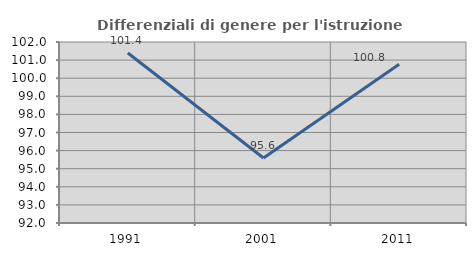
| Category | Differenziali di genere per l'istruzione superiore |
|---|---|
| 1991.0 | 101.391 |
| 2001.0 | 95.594 |
| 2011.0 | 100.775 |